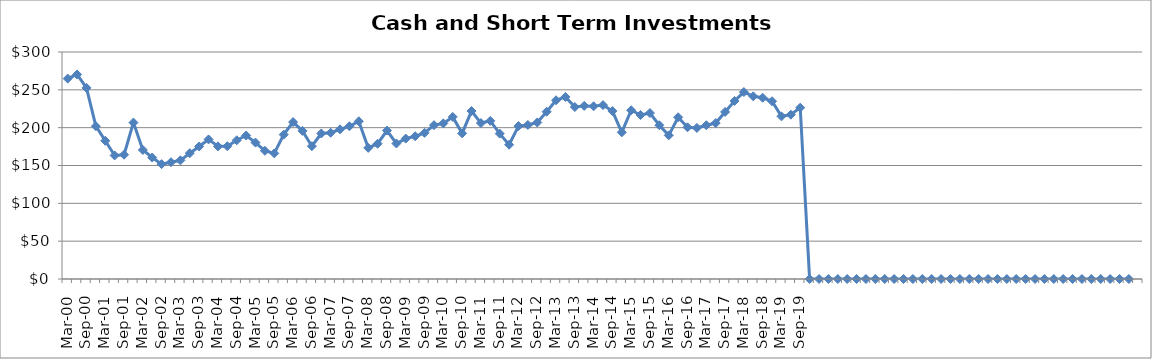
| Category | Cash and Short-Term Investments ($Millions) |
|---|---|
| Mar-00 | 264.86 |
| Jun-00 | 270.294 |
| Sep-00 | 252.585 |
| Dec-00 | 201.964 |
| Mar-01 | 182.688 |
| Jun-01 | 163.291 |
| Sep-01 | 164.23 |
| Dec-01 | 206.732 |
| Mar-02 | 170.556 |
| Jun-02 | 160.53 |
| Sep-02 | 151.794 |
| Dec-02 | 154.323 |
| Mar-03 | 156.822 |
| Jun-03 | 166.239 |
| Sep-03 | 175.155 |
| Dec-03 | 184.479 |
| Mar-04 | 175.287 |
| Jun-04 | 175.479 |
| Sep-04 | 183.354 |
| Dec-04 | 189.661 |
| Mar-05 | 180.311 |
| Jun-05 | 169.417 |
| Sep-05 | 166.057 |
| Dec-05 | 190.766 |
| Mar-06 | 207.375 |
| Jun-06 | 195.788 |
| Sep-06 | 175.53 |
| Dec-06 | 192.299 |
| Mar-07 | 193.28 |
| Jun-07 | 197.818 |
| Sep-07 | 201.843 |
| Dec-07 | 208.444 |
| Mar-08 | 173.316 |
| Jun-08 | 178.764 |
| Sep-08 | 196.179 |
| Dec-08 | 179.11 |
| Mar-09 | 185.574 |
| Jun-09 | 188.637 |
| Sep-09 | 193.174 |
| Dec-09 | 203.312 |
| Mar-10 | 205.652 |
| Jun-10 | 214.23 |
| Sep-10 | 192.468 |
| Dec-10 | 221.967 |
| Mar-11 | 206.066 |
| Jun-11 | 208.965 |
| Sep-11 | 192.13 |
| Dec-11 | 177.434 |
| Mar-12 | 202.108 |
| Jun-12 | 203.607 |
| Sep-12 | 206.848 |
| Dec-12 | 221.08 |
| Mar-13 | 236.195 |
| Jun-13 | 240.593 |
| Sep-13 | 227.285 |
| Dec-13 | 228.788 |
| Mar-14 | 228.278 |
| Jun-14 | 229.872 |
| Sep-14 | 222.024 |
| Dec-14 | 193.809 |
| Mar-15 | 223.052 |
| Jun-15 | 216.701 |
| Sep-15 | 219.329 |
| Dec-15 | 203.186 |
| Mar-16 | 189.863 |
| Jun-16 | 213.763 |
| Sep-16 | 200.518 |
| Dec-16 | 199.663 |
| Mar-17 | 203.218 |
| Jun-17 | 206.09 |
| Sep-17 | 220.81 |
| Dec-17 | 235.303 |
| Mar-18 | 247.037 |
| Jun-18 | 241.429 |
| Sep-18 | 239.546 |
| Dec-18 | 234.898 |
| Mar-19 | 214.999 |
| Jun-19 | 217.159 |
| Sep-19 | 226.425 |